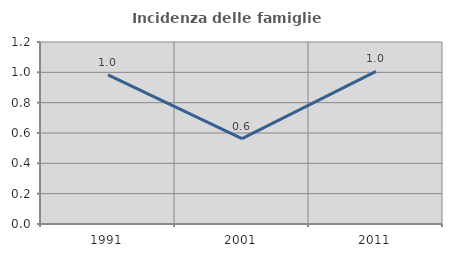
| Category | Incidenza delle famiglie numerose |
|---|---|
| 1991.0 | 0.983 |
| 2001.0 | 0.563 |
| 2011.0 | 1.006 |